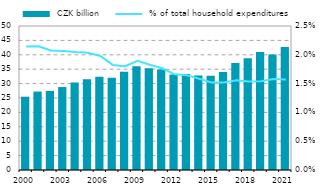
| Category |  CZK billion |
|---|---|
| 2000.0 | 25.451 |
| 2001.0 | 27.243 |
| 2002.0 | 27.473 |
| 2003.0 | 28.797 |
| 2004.0 | 30.341 |
| 2005.0 | 31.532 |
| 2006.0 | 32.371 |
| 2007.0 | 31.994 |
| 2008.0 | 34.093 |
| 2009.0 | 35.989 |
| 2010.0 | 35.305 |
| 2011.0 | 34.868 |
| 2012.0 | 33.151 |
| 2013.0 | 33.324 |
| 2014.0 | 32.792 |
| 2015.0 | 32.698 |
| 2016.0 | 34.045 |
| 2017.0 | 37.17 |
| 2018.0 | 38.837 |
| 2019.0 | 41.015 |
| 2020.0 | 40.085 |
| 2021.0 | 42.672 |